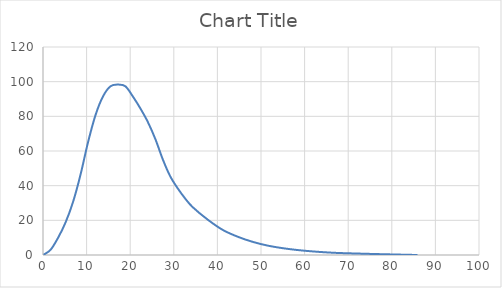
| Category | Series 0 |
|---|---|
| 0.0 | 0 |
| 1.718372292896357 | 2.949 |
| 3.436744585792714 | 9.83 |
| 5.15511687868907 | 18.677 |
| 6.873489171585428 | 30.473 |
| 8.591861464481784 | 46.202 |
| 10.31023375737814 | 64.879 |
| 12.028606050274497 | 80.607 |
| 13.746978343170856 | 91.42 |
| 15.465350636067212 | 97.318 |
| 17.18372292896357 | 98.301 |
| 18.902095221859927 | 97.318 |
| 20.62046751475628 | 91.42 |
| 22.33883980765264 | 84.539 |
| 24.057212100548995 | 76.675 |
| 25.775584393445353 | 66.845 |
| 27.49395668634171 | 55.049 |
| 29.212328979238066 | 45.219 |
| 30.930701272134424 | 38.338 |
| 32.649073565030776 | 32.439 |
| 34.36744585792714 | 27.524 |
| 37.804190443719854 | 20.348 |
| 41.24093502951256 | 14.45 |
| 44.67767961530528 | 10.518 |
| 48.11442420109799 | 7.569 |
| 51.551168786890706 | 5.407 |
| 54.98791337268342 | 3.932 |
| 58.42465795847613 | 2.851 |
| 61.86140254426885 | 2.064 |
| 65.29814713006155 | 1.475 |
| 68.73489171585427 | 1.081 |
| 77.32675318033606 | 0.492 |
| 85.91861464481784 | 0 |